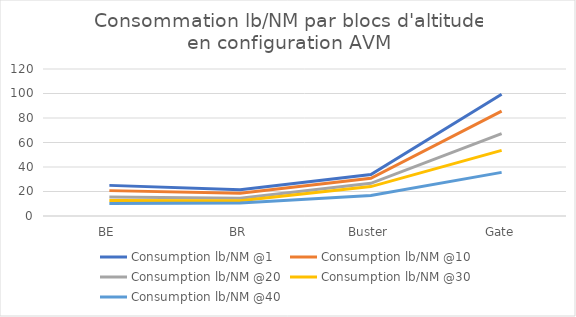
| Category | Consumption lb/NM @1 | Consumption lb/NM @10 | Consumption lb/NM @20 | Consumption lb/NM @30 | Consumption lb/NM @40 |
|---|---|---|---|---|---|
| BE | 25 | 20.714 | 15.476 | 12.69 | 10.191 |
| BR | 21.407 | 18.579 | 14.554 | 12.422 | 10.678 |
| Buster | 33.882 | 30.82 | 26.667 | 24 | 16.786 |
| Gate | 99.407 | 85.594 | 67.273 | 53.58 | 35.608 |